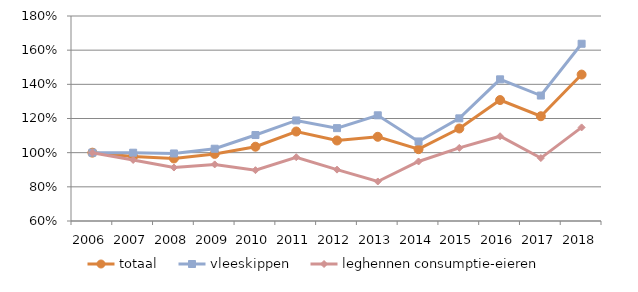
| Category | totaal | vleeskippen | leghennen consumptie-eieren |
|---|---|---|---|
| 2006.0 | 100 | 100 | 100 |
| 2007.0 | 97.813 | 99.978 | 95.73 |
| 2008.0 | 96.62 | 99.534 | 91.29 |
| 2009.0 | 99.277 | 102.309 | 93.121 |
| 2010.0 | 103.484 | 110.324 | 89.753 |
| 2011.0 | 112.377 | 118.859 | 97.347 |
| 2012.0 | 107.128 | 114.362 | 90.065 |
| 2013.0 | 109.291 | 121.869 | 83.124 |
| 2014.0 | 102.044 | 106.557 | 94.846 |
| 2015.0 | 114.153 | 120.086 | 102.781 |
| 2016.0 | 130.797 | 142.928 | 109.624 |
| 2017.0 | 121.33 | 133.436 | 96.832 |
| 2018.0 | 145.716 | 163.751 | 114.784 |